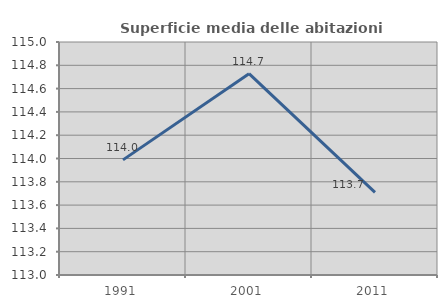
| Category | Superficie media delle abitazioni occupate |
|---|---|
| 1991.0 | 113.988 |
| 2001.0 | 114.728 |
| 2011.0 | 113.709 |